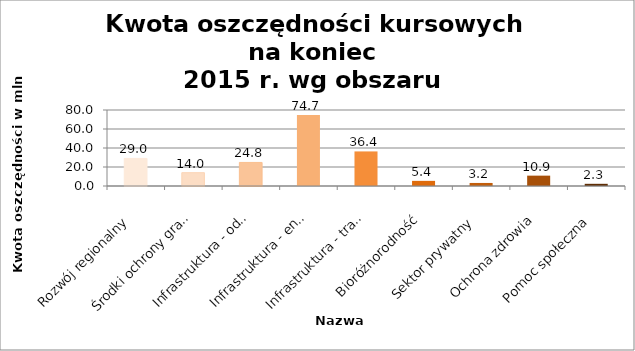
| Category | Series 0 |
|---|---|
| Rozwój regionalny  | 29 |
| Środki ochrony granic | 14 |
| Infrastruktura - odpady | 24.8 |
| Infrastruktura - energia  | 74.7 |
| Infrastruktura - transport  | 36.4 |
| Bioróżnorodność | 5.4 |
| Sektor prywatny  | 3.2 |
| Ochrona zdrowia | 10.9 |
| Pomoc społeczna  | 2.3 |